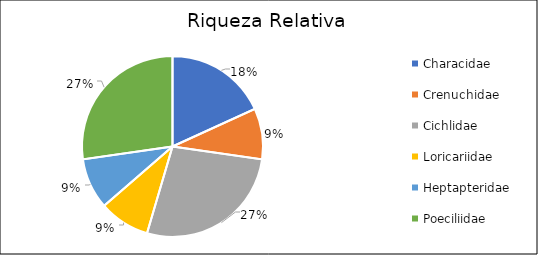
| Category | Series 0 |
|---|---|
| Characidae | 0.182 |
| Crenuchidae  | 0.091 |
| Cichlidae | 0.273 |
| Loricariidae | 0.091 |
| Heptapteridae | 0.091 |
| Poeciliidae | 0.273 |